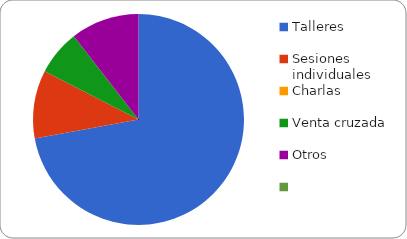
| Category | Series 0 |
|---|---|
| Talleres | 67437 |
| Sesiones individuales | 9770 |
| Charlas | 0 |
| Venta cruzada | 6476 |
| Otros | 9822 |